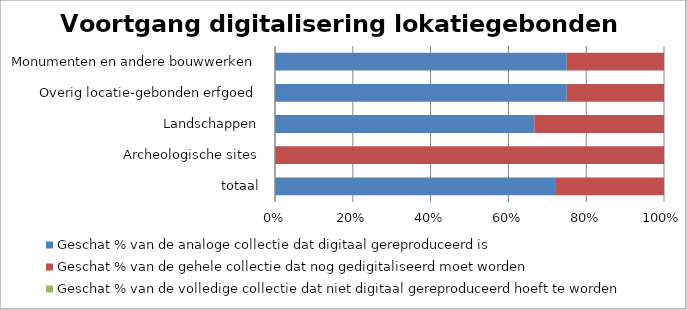
| Category | Geschat % van de analoge collectie dat digitaal gereproduceerd is  | Geschat % van de gehele collectie dat nog gedigitaliseerd moet worden | Geschat % van de volledige collectie dat niet digitaal gereproduceerd hoeft te worden |
|---|---|---|---|
| totaal | 54.167 | 20.833 | 0 |
| Archeologische sites | 0 | 100 | 0 |
| Landschappen | 66.667 | 33.333 | 0 |
| Overig locatie-gebonden erfgoed | 75 | 25 | 0 |
| Monumenten en andere bouwwerken | 75 | 25 | 0 |